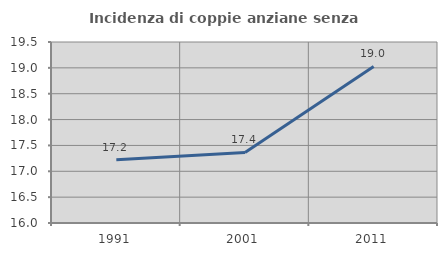
| Category | Incidenza di coppie anziane senza figli  |
|---|---|
| 1991.0 | 17.224 |
| 2001.0 | 17.363 |
| 2011.0 | 19.028 |